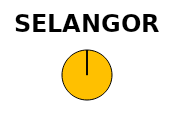
| Category | Series 1 | Series 0 |
|---|---|---|
| Operational Capacity (MW) | 66.98 | 33.996 |
| In progress (MW) | 0 | 0 |